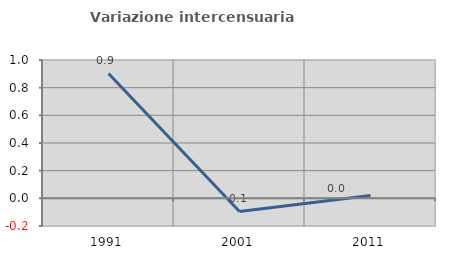
| Category | Variazione intercensuaria annua |
|---|---|
| 1991.0 | 0.902 |
| 2001.0 | -0.095 |
| 2011.0 | 0.02 |